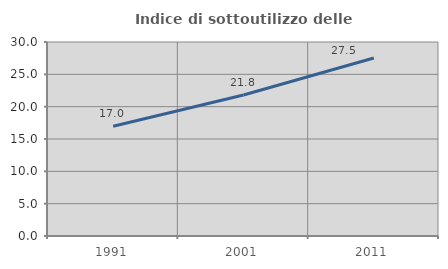
| Category | Indice di sottoutilizzo delle abitazioni  |
|---|---|
| 1991.0 | 16.971 |
| 2001.0 | 21.805 |
| 2011.0 | 27.531 |